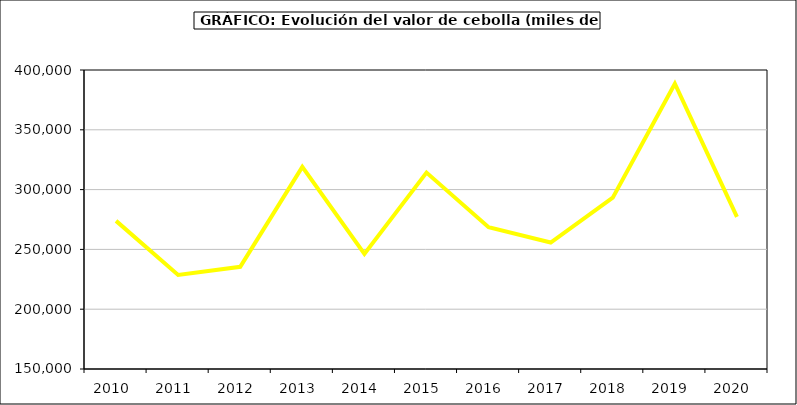
| Category | Valor |
|---|---|
| 2010.0 | 273851.462 |
| 2011.0 | 228687.172 |
| 2012.0 | 235464.837 |
| 2013.0 | 318927.963 |
| 2014.0 | 246223.118 |
| 2015.0 | 314225 |
| 2016.0 | 268515 |
| 2017.0 | 255748.291 |
| 2018.0 | 293282.611 |
| 2019.0 | 388505.94 |
| 2020.0 | 277230.916 |